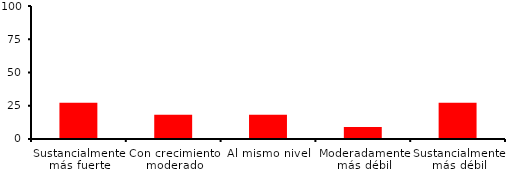
| Category | Series 0 |
|---|---|
| Sustancialmente más fuerte | 27.273 |
| Con crecimiento moderado | 18.182 |
| Al mismo nivel | 18.182 |
| Moderadamente más débil | 9.091 |
| Sustancialmente más débil | 27.273 |